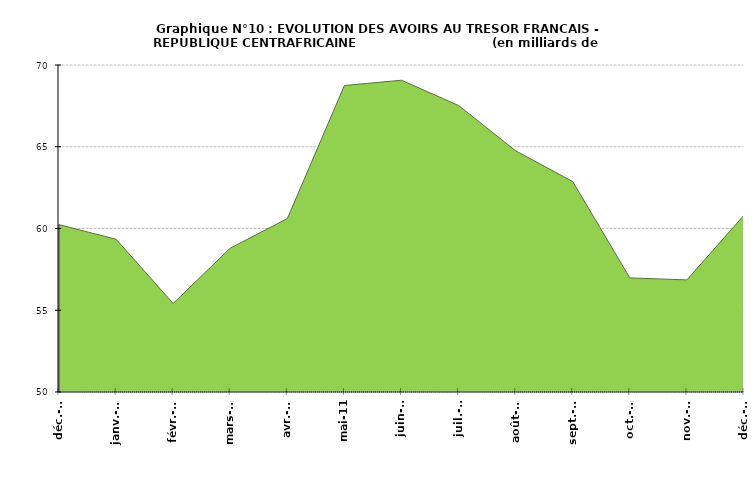
| Category | RCA |
|---|---|
| 2010-12-07 | 60237 |
| 2011-01-08 | 59342 |
| 2011-02-09 | 55414 |
| 2011-03-10 | 58799 |
| 2011-04-08 | 60604 |
| 2011-05-07 | 68748 |
| 2011-06-05 | 69068 |
| 2011-07-04 | 67525 |
| 2011-08-02 | 64751 |
| 2011-09-30 | 62867 |
| 2011-10-30 | 56978 |
| 2011-11-30 | 56856 |
| 2011-12-30 | 60815 |